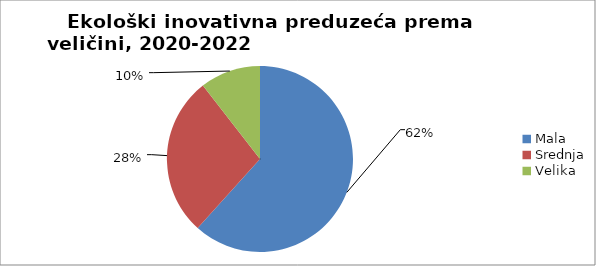
| Category | Ekološki inovativna preduzeća prema veličini, 2020-2022                                              |
|---|---|
| Mala  | 293 |
| Srednja | 132 |
| Velika | 50 |